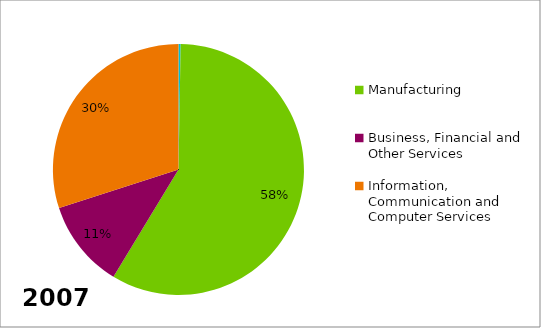
| Category | Series 0 |
|---|---|
| Construction, Utilities and Primary Production | 0.003 |
| Manufacturing | 0.584 |
| Business, Financial and Other Services | 0.114 |
| Information, Communication and Computer Services | 0.3 |